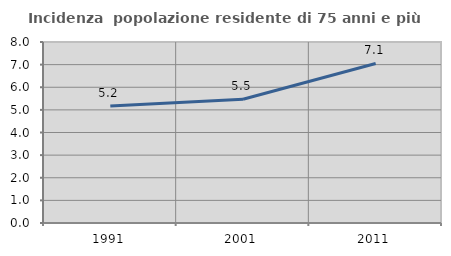
| Category | Incidenza  popolazione residente di 75 anni e più |
|---|---|
| 1991.0 | 5.175 |
| 2001.0 | 5.467 |
| 2011.0 | 7.05 |